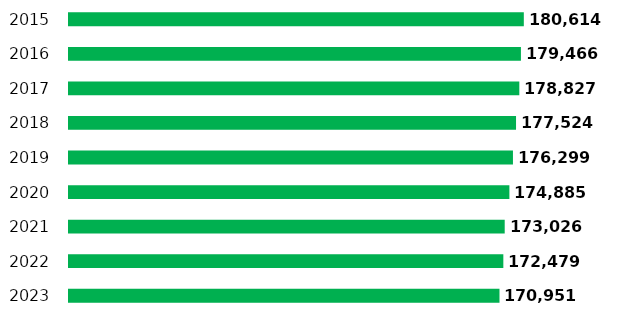
| Category | al 1° gennaio |
|---|---|
| 2023.0 | 170951 |
| 2022.0 | 172479 |
| 2021.0 | 173026 |
| 2020.0 | 174885 |
| 2019.0 | 176299 |
| 2018.0 | 177524 |
| 2017.0 | 178827 |
| 2016.0 | 179466 |
| 2015.0 | 180614 |